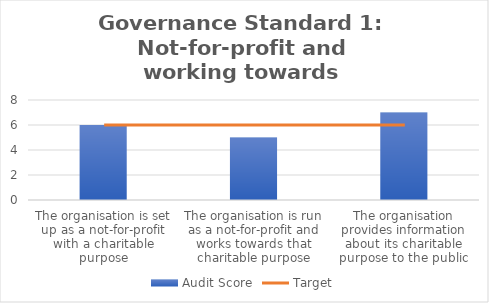
| Category | Audit Score |
|---|---|
| The organisation is set up as a not-for-profit with a charitable purpose | 6 |
| The organisation is run as a not-for-profit and works towards that charitable purpose | 5 |
| The organisation provides information about its charitable purpose to the public | 7 |